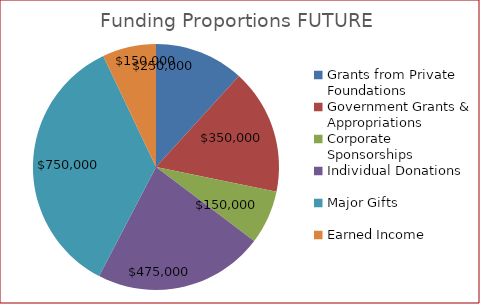
| Category | Series 0 | Series 1 |
|---|---|---|
| Grants from Private Foundations | 250000 | 0.118 |
| Government Grants & Appropriations | 350000 | 0.165 |
| Corporate Sponsorships | 150000 | 0.071 |
| Individual Donations | 475000 | 0.224 |
| Major Gifts | 750000 | 0.353 |
| Earned Income | 150000 | 0.071 |